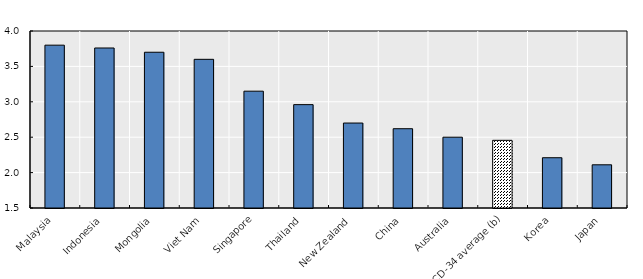
| Category | All households |
|---|---|
| Malaysia | 3.8 |
| Indonesia | 3.76 |
| Mongolia | 3.7 |
| Viet Nam | 3.6 |
| Singapore | 3.15 |
| Thailand | 2.96 |
| New Zealand | 2.7 |
| China | 2.62 |
| Australia | 2.5 |
| OECD-34 average (b) | 2.456 |
| Korea | 2.21 |
| Japan | 2.11 |